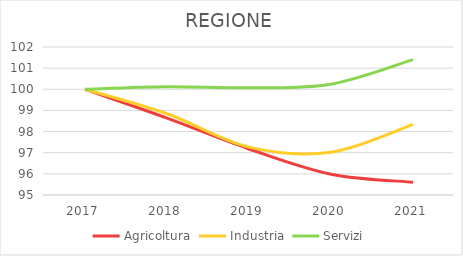
| Category | Agricoltura | Industria | Servizi |
|---|---|---|---|
| 2017.0 | 100 | 100 | 100 |
| 2018.0 | 98.634 | 98.842 | 100.117 |
| 2019.0 | 97.178 | 97.264 | 100.074 |
| 2020.0 | 95.985 | 97.027 | 100.242 |
| 2021.0 | 95.604 | 98.341 | 101.402 |